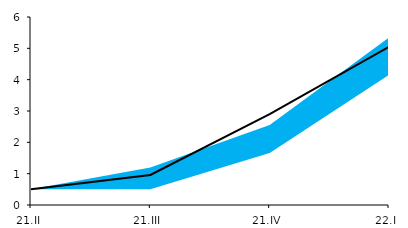
| Category | Series 0 |
|---|---|
| 21.II | 0.5 |
| 21.III | 0.957 |
| 21.IV | 2.9 |
| 22.I | 5.05 |